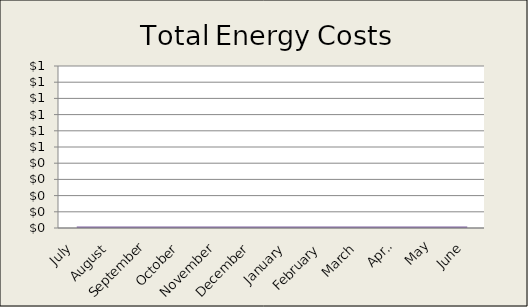
| Category | Total Energy Costs |
|---|---|
| 0 | 0 |
| 1 | 0 |
| 2 | 0 |
| 3 | 0 |
| 4 | 0 |
| 5 | 0 |
| 6 | 0 |
| 7 | 0 |
| 8 | 0 |
| 9 | 0 |
| 10 | 0 |
| 11 | 0 |